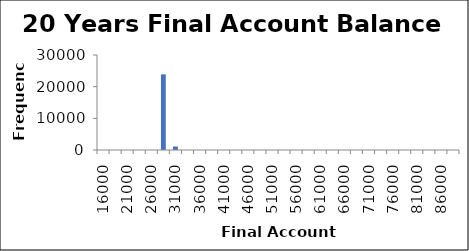
| Category | Frequency |
|---|---|
| 16000.0 | 0 |
| 18500.0 | 0 |
| 21000.0 | 0 |
| 23500.0 | 0 |
| 26000.0 | 1 |
| 28500.0 | 23894 |
| 31000.0 | 1105 |
| 33500.0 | 0 |
| 36000.0 | 0 |
| 38500.0 | 0 |
| 41000.0 | 0 |
| 43500.0 | 0 |
| 46000.0 | 0 |
| 48500.0 | 0 |
| 51000.0 | 0 |
| 53500.0 | 0 |
| 56000.0 | 0 |
| 58500.0 | 0 |
| 61000.0 | 0 |
| 63500.0 | 0 |
| 66000.0 | 0 |
| 68500.0 | 0 |
| 71000.0 | 0 |
| 73500.0 | 0 |
| 76000.0 | 0 |
| 78500.0 | 0 |
| 81000.0 | 0 |
| 83500.0 | 0 |
| 86000.0 | 0 |
| More | 0 |